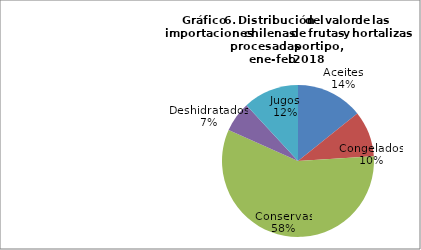
| Category | Series 0 |
|---|---|
| Aceites | 9014144.87 |
| Congelados | 6169514.6 |
| Conservas | 36494021.73 |
| Deshidratados | 4086199.88 |
| Jugos | 7500295.8 |